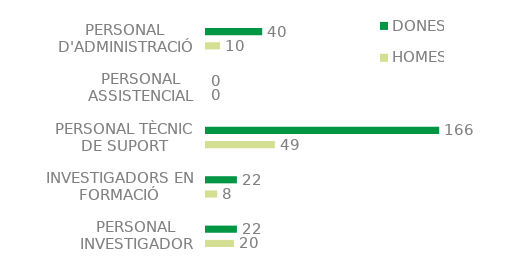
| Category | HOMES | DONES |
|---|---|---|
| PERSONAL INVESTIGADOR | 20 | 22 |
| INVESTIGADORS EN FORMACIÓ | 8 | 22 |
| PERSONAL TÈCNIC DE SUPORT | 49 | 166 |
| PERSONAL ASSISTENCIAL | 0 | 0 |
| PERSONAL D'ADMINISTRACIÓ | 10 | 40 |